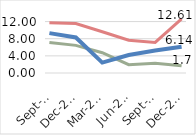
| Category | אירופה | ארה"ב | ישראל |
|---|---|---|---|
| 2019-09-01 | 7.14 | 11.75 | 9.299 |
| 2019-12-01 | 6.45 | 11.53 | 8.299 |
| 2020-03-01 | 4.74 | 9.63 | 2.432 |
| 2020-06-01 | 1.93 | 7.66 | 4.2 |
| 2020-09-01 | 2.29 | 7.13 | 5.258 |
| 2020-12-01 | 1.7 | 12.61 | 6.14 |